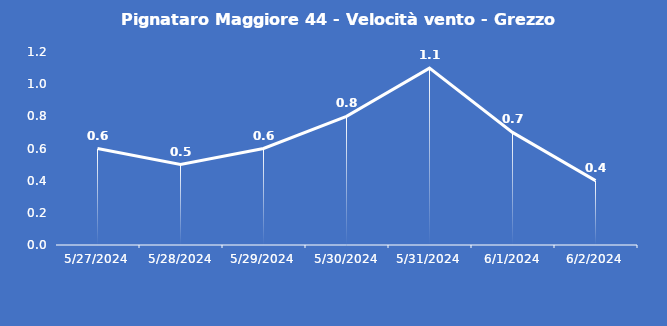
| Category | Pignataro Maggiore 44 - Velocità vento - Grezzo (m/s) |
|---|---|
| 5/27/24 | 0.6 |
| 5/28/24 | 0.5 |
| 5/29/24 | 0.6 |
| 5/30/24 | 0.8 |
| 5/31/24 | 1.1 |
| 6/1/24 | 0.7 |
| 6/2/24 | 0.4 |